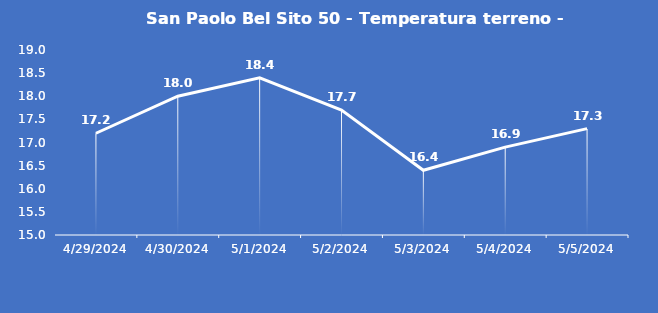
| Category | San Paolo Bel Sito 50 - Temperatura terreno - Grezzo (°C) |
|---|---|
| 4/29/24 | 17.2 |
| 4/30/24 | 18 |
| 5/1/24 | 18.4 |
| 5/2/24 | 17.7 |
| 5/3/24 | 16.4 |
| 5/4/24 | 16.9 |
| 5/5/24 | 17.3 |